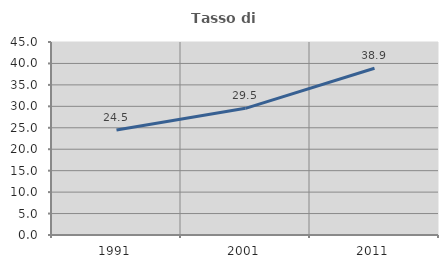
| Category | Tasso di occupazione   |
|---|---|
| 1991.0 | 24.462 |
| 2001.0 | 29.53 |
| 2011.0 | 38.876 |